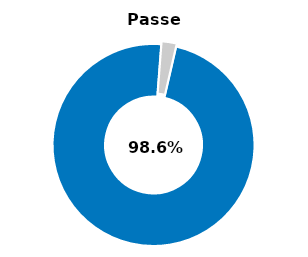
| Category | Series 0 |
|---|---|
| Passed | 0.976 |
| Other | 0.024 |